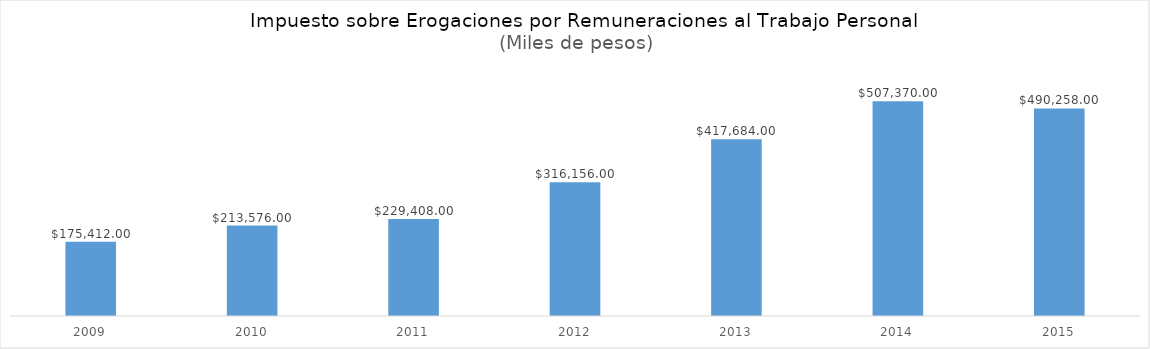
| Category | Impuesto sobre Nómina |
|---|---|
| 2009.0 | 175412 |
| 2010.0 | 213576 |
| 2011.0 | 229408 |
| 2012.0 | 316156 |
| 2013.0 | 417684 |
| 2014.0 | 507370 |
| 2015.0 | 490258 |